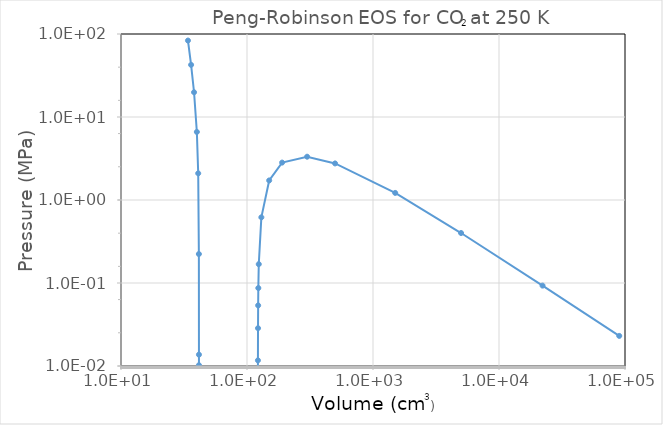
| Category | Series 0 |
|---|---|
| 34.0 | 83.379 |
| 36.0 | 42.472 |
| 38.0 | 19.868 |
| 40.0 | 6.607 |
| 41.0 | 2.096 |
| 41.5 | 0.223 |
| 41.56 | 0.014 |
| 41.561 | 0.01 |
| 122.0 | 0.003 |
| 122.1 | 0.012 |
| 122.3 | 0.029 |
| 122.6 | 0.054 |
| 123.0 | 0.087 |
| 124.0 | 0.169 |
| 130.0 | 0.618 |
| 150.0 | 1.72 |
| 190.0 | 2.823 |
| 300.0 | 3.323 |
| 500.0 | 2.758 |
| 1500.0 | 1.217 |
| 5000.0 | 0.4 |
| 22160.0 | 0.093 |
| 90000.0 | 0.023 |